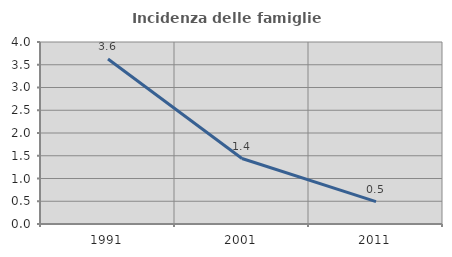
| Category | Incidenza delle famiglie numerose |
|---|---|
| 1991.0 | 3.628 |
| 2001.0 | 1.439 |
| 2011.0 | 0.49 |